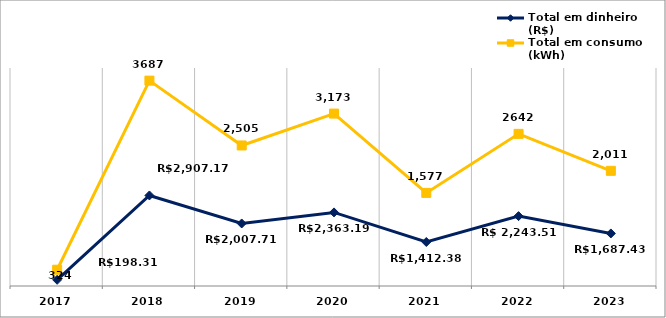
| Category | Total em dinheiro (R$) | Total em consumo (kWh) |
|---|---|---|
| 2017.0 | 198.31 | 324 |
| 2018.0 | 2907.17 | 3687 |
| 2019.0 | 2007.71 | 2505 |
| 2020.0 | 2363.19 | 3173 |
| 2021.0 | 1412.38 | 1577 |
| 2022.0 | 2243.51 | 2642 |
| 2023.0 | 1687.43 | 2011 |